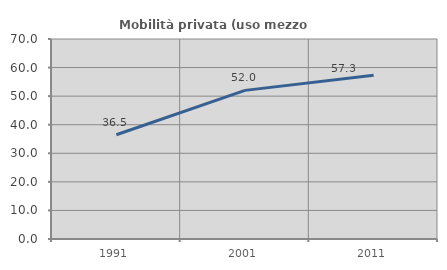
| Category | Mobilità privata (uso mezzo privato) |
|---|---|
| 1991.0 | 36.479 |
| 2001.0 | 52.016 |
| 2011.0 | 57.349 |